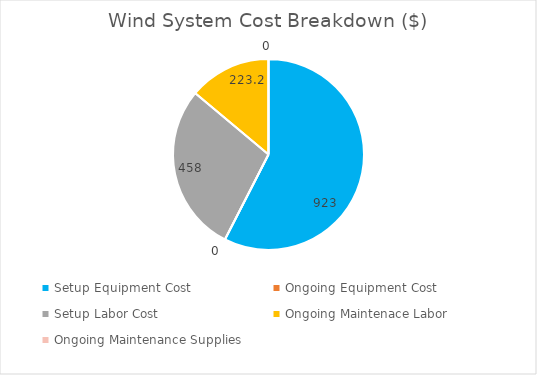
| Category | Series 0 |
|---|---|
| Setup Equipment Cost | 923 |
| Ongoing Equipment Cost | 0 |
| Setup Labor Cost | 458 |
| Ongoing Maintenace Labor | 223.2 |
| Ongoing Maintenance Supplies | 0 |